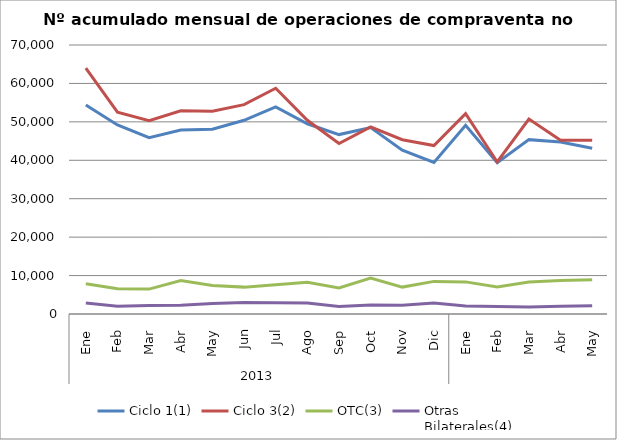
| Category | Ciclo 1(1) | Ciclo 3(2) | OTC(3) | Otras
Bilaterales(4) |
|---|---|---|---|---|
| 0 | 54386 | 63960 | 7873 | 2891 |
| 1 | 49196 | 52525 | 6550 | 2012 |
| 2 | 45892 | 50320 | 6475 | 2233 |
| 3 | 47876 | 52874 | 8686 | 2274 |
| 4 | 48091 | 52767 | 7394 | 2733 |
| 5 | 50415 | 54485 | 6994 | 3021 |
| 6 | 53879 | 58744 | 7586 | 2959 |
| 7 | 49504 | 50401 | 8243 | 2889 |
| 8 | 46688 | 44370 | 6784 | 1951 |
| 9 | 48531 | 48693 | 9357 | 2324 |
| 10 | 42642 | 45362 | 7000 | 2275 |
| 11 | 39447 | 43831 | 8487 | 2831 |
| 12 | 49087 | 52117 | 8357 | 2090 |
| 13 | 39397 | 39565 | 7045 | 1958 |
| 14 | 45373 | 50721 | 8313 | 1843 |
| 15 | 44744 | 45214 | 8739 | 2016 |
| 16 | 43118 | 45196 | 8896 | 2164 |